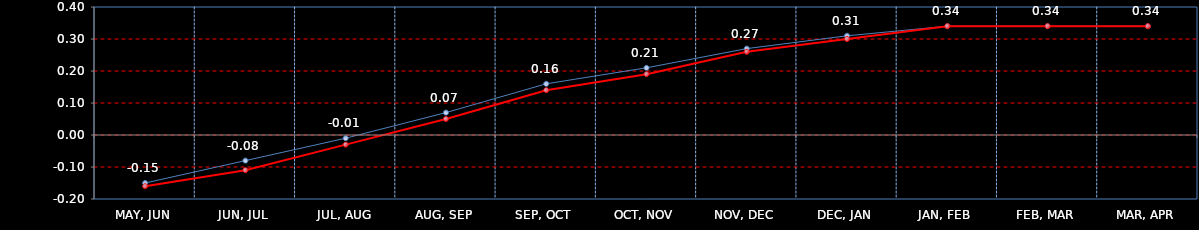
| Category | Last | Settlement | First MA | Second MA | Third MA |
|---|---|---|---|---|---|
| MAY, JUN | -0.15 | -0.16 |  |  |  |
| JUN, JUL | -0.08 | -0.11 |  |  |  |
| JUL, AUG | -0.01 | -0.03 |  |  |  |
| AUG, SEP | 0.07 | 0.05 |  |  |  |
| SEP, OCT | 0.16 | 0.14 |  |  |  |
| OCT, NOV | 0.21 | 0.19 |  |  |  |
| NOV, DEC | 0.27 | 0.26 |  |  |  |
| DEC, JAN | 0.31 | 0.3 |  |  |  |
| JAN, FEB | 0.34 | 0.34 |  |  |  |
| FEB, MAR | 0.34 | 0.34 |  |  |  |
| MAR, APR | 0.34 | 0.34 |  |  |  |